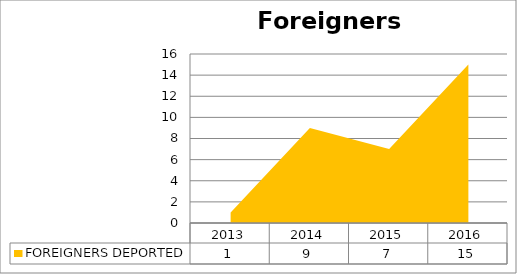
| Category | FOREIGNERS DEPORTED |
|---|---|
| 2013.0 | 1 |
| 2014.0 | 9 |
| 2015.0 | 7 |
| 2016.0 | 15 |